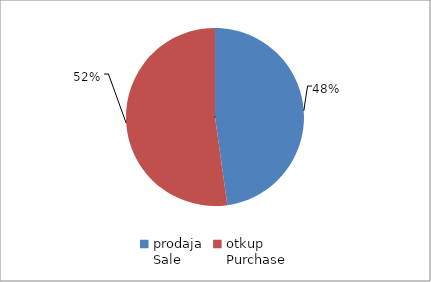
| Category | Series 0 |
|---|---|
| prodaja
Sale | 12658304 |
| otkup
Purchase | 13835955.05 |